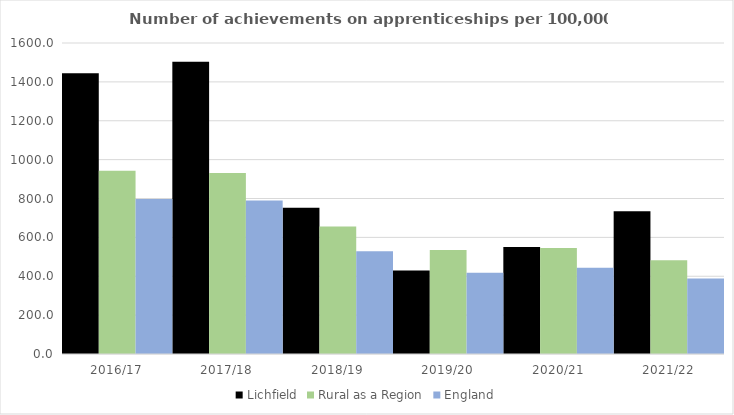
| Category | Lichfield | Rural as a Region | England |
|---|---|---|---|
| 2016/17 | 1445 | 942.594 | 797 |
| 2017/18 | 1504 | 931.709 | 790 |
| 2018/19 | 753 | 656.44 | 528 |
| 2019/20 | 430 | 535.552 | 418 |
| 2020/21 | 551 | 545.333 | 444 |
| 2021/22 | 734 | 482.936 | 389 |